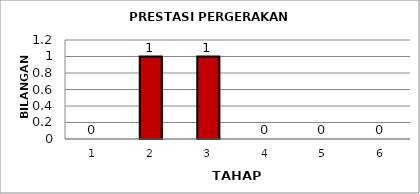
| Category | Series 0 |
|---|---|
| 1.0 | 0 |
| 2.0 | 1 |
| 3.0 | 1 |
| 4.0 | 0 |
| 5.0 | 0 |
| 6.0 | 0 |